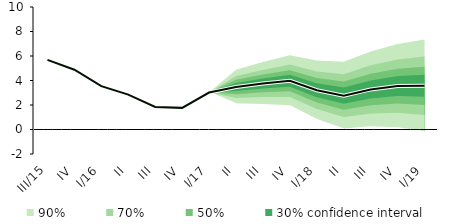
| Category | linka | Střed předpovědi |
|---|---|---|
| III/15 | 5.688 | 5.688 |
| IV | 4.881 | 4.881 |
| I/16 | 3.541 | 3.541 |
| II | 2.848 | 2.848 |
| III | 1.844 | 1.844 |
| IV | 1.766 | 1.766 |
| I/17 | 3.015 | 3.015 |
| II | 3.47 | 3.47 |
| III | 3.756 | 3.756 |
| IV | 3.98 | 3.98 |
| I/18 | 3.208 | 3.208 |
| II | 2.765 | 2.765 |
| III | 3.272 | 3.272 |
| IV | 3.542 | 3.542 |
| I/19 | 3.567 | 3.567 |